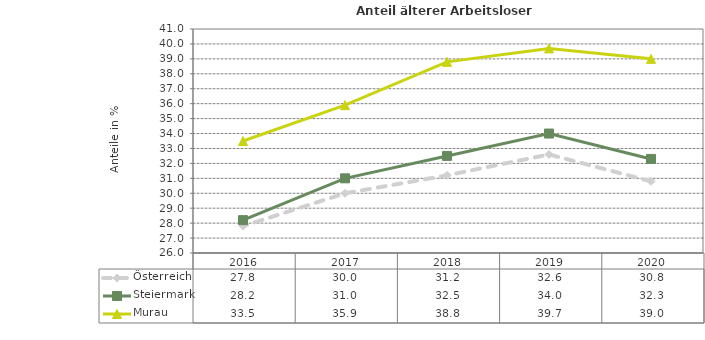
| Category | Österreich | Steiermark | Murau |
|---|---|---|---|
| 2020.0 | 30.8 | 32.3 | 39 |
| 2019.0 | 32.6 | 34 | 39.7 |
| 2018.0 | 31.2 | 32.5 | 38.8 |
| 2017.0 | 30 | 31 | 35.9 |
| 2016.0 | 27.8 | 28.2 | 33.5 |